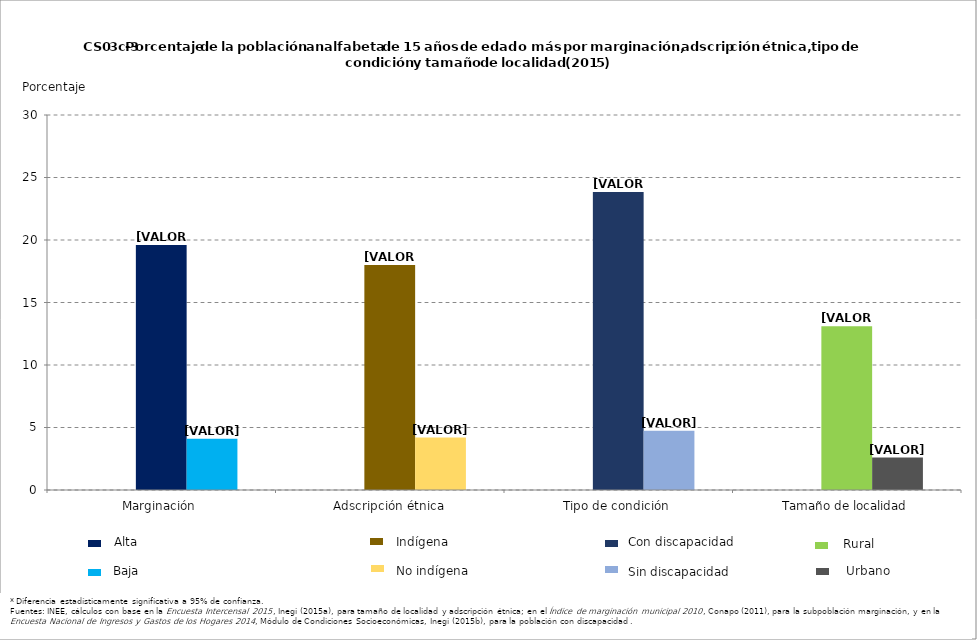
| Category | Series 0 | Series 1 | Series 2 |
|---|---|---|---|
| Marginación |  | 19.6 | 4.1 |
| Adscripción étnica |  | 18 | 4.2 |
| Tipo de condición |  | 23.849 | 4.745 |
| Tamaño de localidad |  | 13.1 | 2.6 |